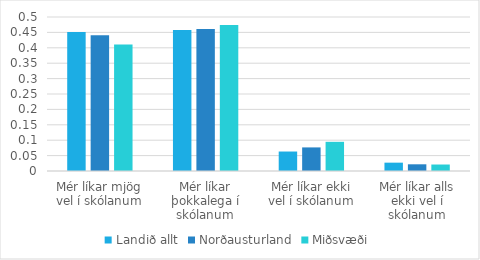
| Category | Landið allt | Norðausturland | Miðsvæði |
|---|---|---|---|
| Mér líkar mjög vel í skólanum | 0.452 | 0.44 | 0.411 |
| Mér líkar þokkalega í skólanum | 0.458 | 0.461 | 0.474 |
| Mér líkar ekki vel í skólanum | 0.063 | 0.077 | 0.095 |
| Mér líkar alls ekki vel í skólanum | 0.027 | 0.022 | 0.021 |